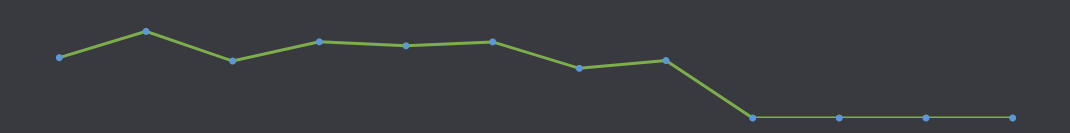
| Category | Dinheiro Disponível |
|---|---|
| JAN | 820 |
| FEV | 1177 |
| MAR | 774 |
| ABR | 1035 |
| MAI | 981 |
| JUN | 1034 |
| JUL | 675 |
| AGO | 781 |
| SET | 0 |
| OUT | 0 |
| NOV | 0 |
| DEZ | 0 |